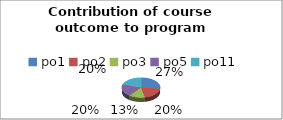
| Category | Contribution |
|---|---|
| po1 | 0.27 |
| po2 | 0.2 |
| po3 | 0.13 |
| po5 | 0.2 |
| po11 | 0.2 |